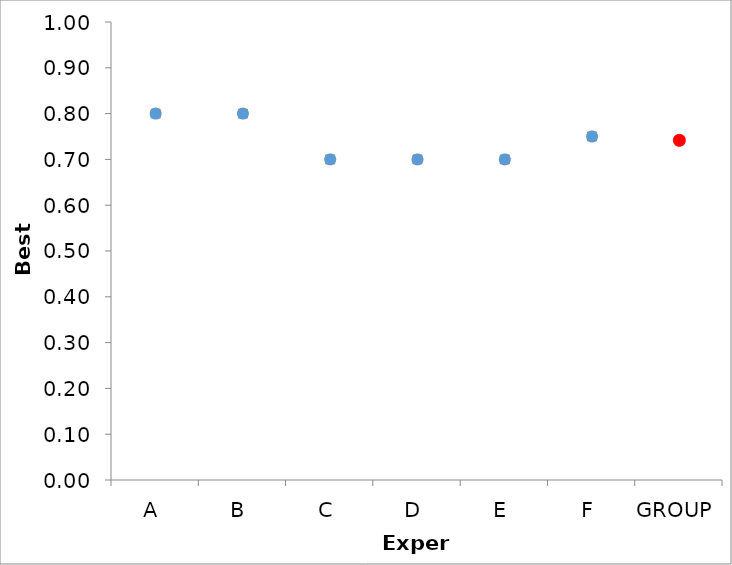
| Category | Series 1 | Series 0 |
|---|---|---|
| A | 0.8 | 0.8 |
| B | 0.8 | 0.8 |
| C | 0.7 | 0.7 |
| D | 0.7 | 0.7 |
| E | 0.7 | 0.7 |
| F | 0.75 | 0.75 |
| GROUP | 0.742 | 0.742 |